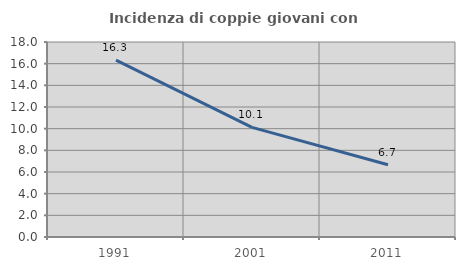
| Category | Incidenza di coppie giovani con figli |
|---|---|
| 1991.0 | 16.328 |
| 2001.0 | 10.117 |
| 2011.0 | 6.671 |